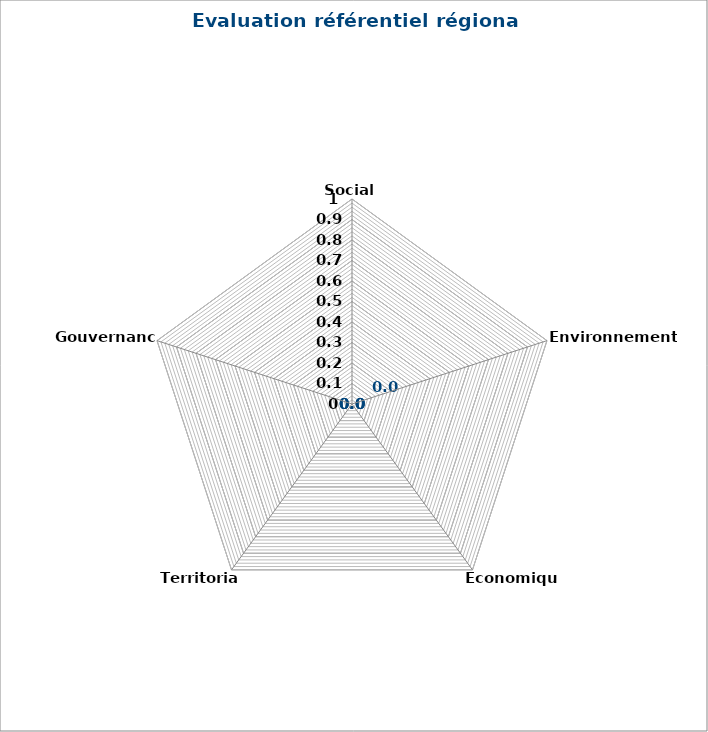
| Category | Series 0 |
|---|---|
| Social  | 0 |
| Environnemental | 0 |
| Economique | 0 |
| Territorial | 0 |
| Gouvernance | 0 |